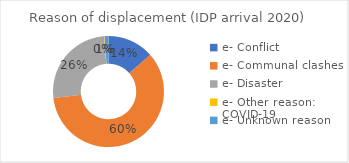
| Category | Series 0 |
|---|---|
| e- Conflict | 35388 |
| e- Communal clashes | 155932 |
| e- Disaster | 66970 |
| e- Other reason: COVID-19 | 384 |
| e- Unknown reason | 2956 |